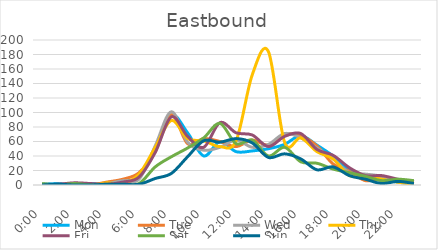
| Category | Mon | Tue | Wed | Thu | Fri | Sat | Sun |
|---|---|---|---|---|---|---|---|
| 0.0 | 1 | 0 | 1 | 0 | 0 | 2 | 0 |
| 0.041667 | 2 | 0 | 1 | 0 | 1 | 0 | 1 |
| 0.083333 | 0 | 1 | 1 | 1 | 3 | 2 | 0 |
| 0.125 | 2 | 0 | 1 | 0 | 2 | 0 | 0 |
| 0.166667 | 1 | 4 | 2 | 3 | 1 | 0 | 1 |
| 0.208333 | 5 | 8 | 6 | 2 | 4 | 1 | 1 |
| 0.25 | 11 | 17 | 8 | 15 | 11 | 2 | 1 |
| 0.291667 | 48 | 46 | 54 | 52 | 45 | 25 | 9 |
| 0.333333 | 96 | 97 | 101 | 89 | 94 | 39 | 16 |
| 0.375 | 72 | 57 | 59 | 64 | 67 | 51 | 39 |
| 0.416667 | 40 | 64 | 48 | 61 | 52 | 65 | 61 |
| 0.458333 | 60 | 60 | 52 | 53 | 86 | 85 | 59 |
| 0.5 | 46 | 53 | 62 | 61 | 72 | 57 | 64 |
| 0.541667 | 47 | 62 | 52 | 152 | 69 | 62 | 58 |
| 0.5833333333333334 | 50 | 55 | 56 | 184 | 53 | 40 | 38 |
| 0.625 | 56 | 70 | 71 | 59 | 67 | 52 | 43 |
| 0.666667 | 68 | 68 | 65 | 65 | 71 | 32 | 36 |
| 0.708333 | 55 | 54 | 51 | 46 | 49 | 30 | 21 |
| 0.75 | 40 | 29 | 36 | 36 | 41 | 22 | 25 |
| 0.791667 | 21 | 19 | 17 | 13 | 24 | 17 | 13 |
| 0.833333 | 10 | 6 | 15 | 12 | 13 | 12 | 8 |
| 0.875 | 7 | 9 | 12 | 8 | 13 | 6 | 2 |
| 0.916667 | 4 | 7 | 4 | 4 | 8 | 8 | 5 |
| 0.958333 | 1 | 2 | 2 | 1 | 4 | 6 | 2 |